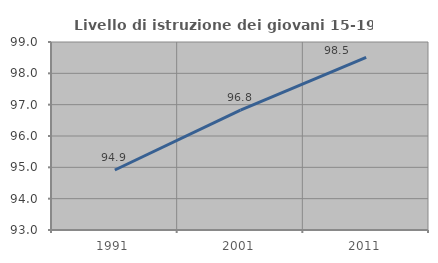
| Category | Livello di istruzione dei giovani 15-19 anni |
|---|---|
| 1991.0 | 94.915 |
| 2001.0 | 96.825 |
| 2011.0 | 98.507 |